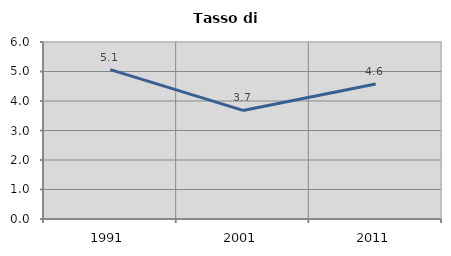
| Category | Tasso di disoccupazione   |
|---|---|
| 1991.0 | 5.063 |
| 2001.0 | 3.681 |
| 2011.0 | 4.575 |